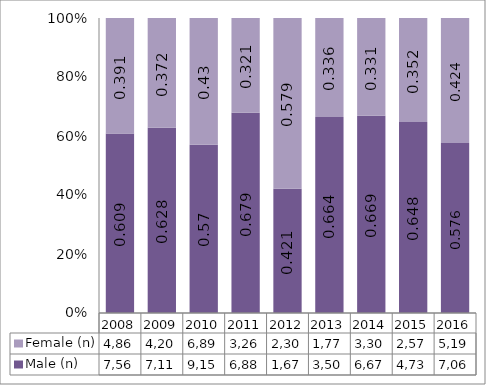
| Category | Male (n) | Female (n) |
|---|---|---|
| 2008.0 | 7568 | 4867 |
| 2009.0 | 7113 | 4208 |
| 2010.0 | 9159 | 6899 |
| 2011.0 | 6886 | 3260 |
| 2012.0 | 1675 | 2302 |
| 2013.0 | 3509 | 1772 |
| 2014.0 | 6679 | 3308 |
| 2015.0 | 4736 | 2578 |
| 2016.0 | 7063 | 5195 |